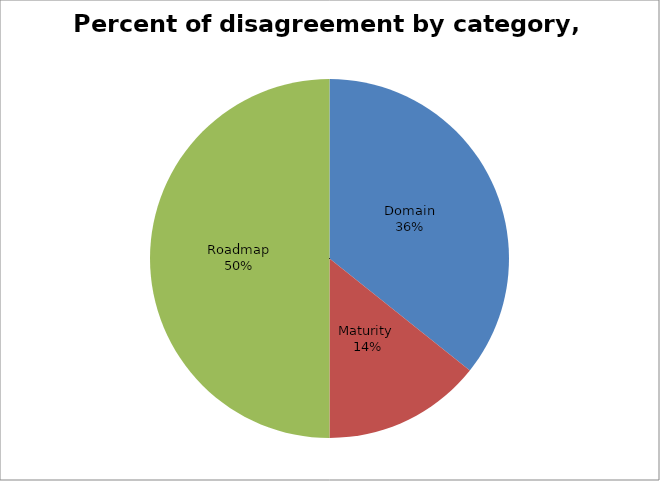
| Category | Percent of disagreement by category, secondary |
|---|---|
| Domain | 5 |
| Maturity  | 2 |
| Roadmap | 7 |